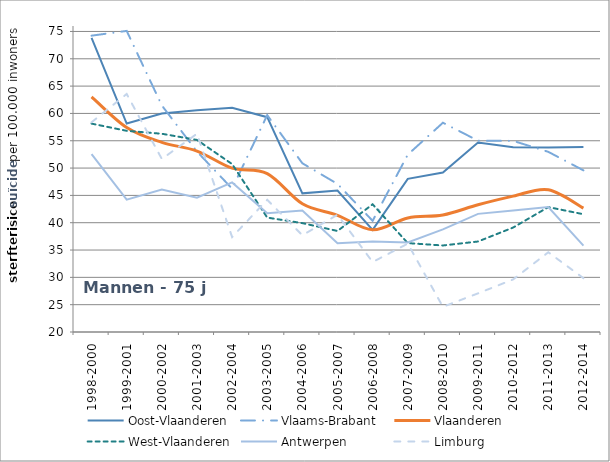
| Category | Oost-Vlaanderen | Vlaams-Brabant | Vlaanderen | West-Vlaanderen | Antwerpen | Limburg |
|---|---|---|---|---|---|---|
| 1998-2000 | 73.848 | 74.231 | 63.047 | 58.134 | 52.566 | 58.381 |
| 1999-2001 | 58.155 | 75.102 | 57.412 | 56.817 | 44.208 | 63.56 |
| 2000-2002 | 59.967 | 61.459 | 54.701 | 56.281 | 46.086 | 51.668 |
| 2001-2003 | 60.583 | 53.024 | 53.115 | 55.149 | 44.593 | 56.285 |
| 2002-2004 | 61.052 | 46.237 | 49.98 | 50.733 | 47.37 | 37.368 |
| 2003-2005 | 59.315 | 59.685 | 48.976 | 40.936 | 41.754 | 44.192 |
| 2004-2006 | 45.375 | 50.877 | 43.463 | 39.925 | 42.237 | 37.703 |
| 2005-2007 | 45.9 | 47.099 | 41.359 | 38.488 | 36.24 | 41.46 |
| 2006-2008 | 38.683 | 40.341 | 38.712 | 43.371 | 36.58 | 32.8 |
| 2007-2009 | 48.02 | 52.455 | 40.879 | 36.266 | 36.368 | 36.176 |
| 2008-2010 | 49.18 | 58.296 | 41.405 | 35.835 | 38.791 | 24.609 |
| 2009-2011 | 54.667 | 55.011 | 43.276 | 36.561 | 41.62 | 27.072 |
| 2010-2012 | 53.801 | 54.98 | 44.861 | 39.122 | 42.222 | 29.624 |
| 2011-2013 | 53.777 | 52.97 | 46.032 | 42.856 | 42.867 | 34.593 |
| 2012-2014 | 53.871 | 49.581 | 42.659 | 41.554 | 35.796 | 29.852 |